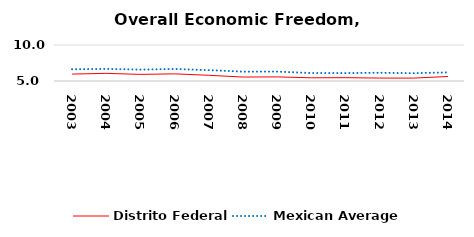
| Category | Distrito Federal  | Mexican Average  |
|---|---|---|
| 2003.0 | 5.963 | 6.632 |
| 2004.0 | 6.062 | 6.678 |
| 2005.0 | 5.918 | 6.582 |
| 2006.0 | 5.993 | 6.668 |
| 2007.0 | 5.793 | 6.508 |
| 2008.0 | 5.549 | 6.3 |
| 2009.0 | 5.571 | 6.3 |
| 2010.0 | 5.445 | 6.105 |
| 2011.0 | 5.463 | 6.103 |
| 2012.0 | 5.406 | 6.144 |
| 2013.0 | 5.403 | 6.087 |
| 2014.0 | 5.626 | 6.195 |